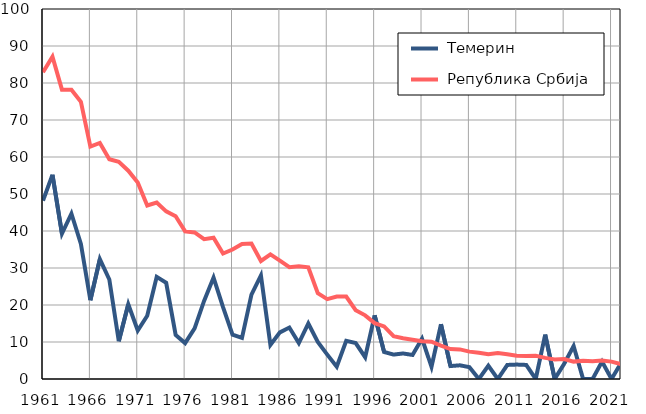
| Category |  Темерин |  Република Србија |
|---|---|---|
| 1961.0 | 48.2 | 82.9 |
| 1962.0 | 55.2 | 87.1 |
| 1963.0 | 39.3 | 78.2 |
| 1964.0 | 44.7 | 78.2 |
| 1965.0 | 36.5 | 74.9 |
| 1966.0 | 21.3 | 62.8 |
| 1967.0 | 32.4 | 63.8 |
| 1968.0 | 26.9 | 59.4 |
| 1969.0 | 10.2 | 58.7 |
| 1970.0 | 20.2 | 56.3 |
| 1971.0 | 13.1 | 53.1 |
| 1972.0 | 17.1 | 46.9 |
| 1973.0 | 27.6 | 47.7 |
| 1974.0 | 26 | 45.3 |
| 1975.0 | 11.9 | 44 |
| 1976.0 | 9.7 | 39.9 |
| 1977.0 | 13.7 | 39.6 |
| 1978.0 | 21.1 | 37.8 |
| 1979.0 | 27.4 | 38.2 |
| 1980.0 | 19.4 | 33.9 |
| 1981.0 | 12 | 35 |
| 1982.0 | 11.1 | 36.5 |
| 1983.0 | 22.8 | 36.6 |
| 1984.0 | 28 | 31.9 |
| 1985.0 | 9.2 | 33.7 |
| 1986.0 | 12.6 | 32 |
| 1987.0 | 13.9 | 30.2 |
| 1988.0 | 9.7 | 30.5 |
| 1989.0 | 15 | 30.2 |
| 1990.0 | 10 | 23.2 |
| 1991.0 | 6.6 | 21.6 |
| 1992.0 | 3.3 | 22.3 |
| 1993.0 | 10.3 | 22.3 |
| 1994.0 | 9.7 | 18.6 |
| 1995.0 | 5.9 | 17.2 |
| 1996.0 | 17.2 | 15.1 |
| 1997.0 | 7.3 | 14.2 |
| 1998.0 | 6.6 | 11.6 |
| 1999.0 | 6.9 | 11 |
| 2000.0 | 6.5 | 10.6 |
| 2001.0 | 10.9 | 10.2 |
| 2002.0 | 3.3 | 10.1 |
| 2003.0 | 14.8 | 9 |
| 2004.0 | 3.5 | 8.1 |
| 2005.0 | 3.7 | 8 |
| 2006.0 | 3.2 | 7.4 |
| 2007.0 | 0 | 7.1 |
| 2008.0 | 3.6 | 6.7 |
| 2009.0 | 0 | 7 |
| 2010.0 | 3.8 | 6.7 |
| 2011.0 | 3.9 | 6.3 |
| 2012.0 | 3.8 | 6.2 |
| 2013.0 | 0 | 6.3 |
| 2014.0 | 12 | 5.7 |
| 2015.0 | 0 | 5.3 |
| 2016.0 | 4.1 | 5.4 |
| 2017.0 | 8.9 | 4.7 |
| 2018.0 | 0 | 4.9 |
| 2019.0 | 0 | 4.8 |
| 2020.0 | 4.7 | 5 |
| 2021.0 | 0 | 4.7 |
| 2022.0 | 4.3 | 4 |